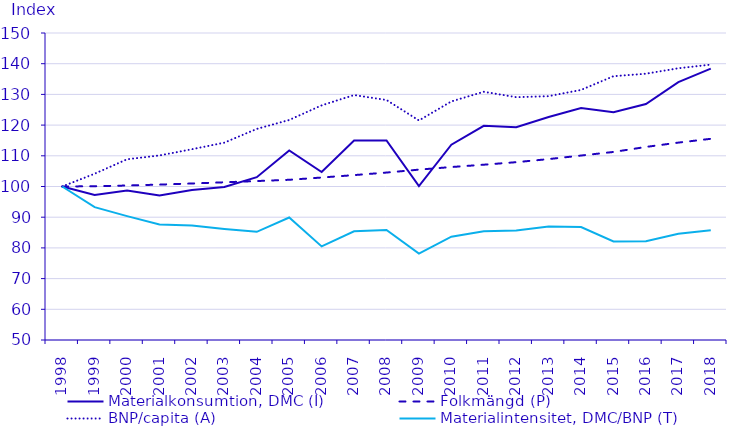
| Category | Materialkonsumtion, DMC (I) | Folkmängd (P) | BNP/capita (A) | Materialintensitet, DMC/BNP (T) |
|---|---|---|---|---|
| 1998.0 | 100 | 100 | 100 | 100 |
| 1999.0 | 97.241 | 100.08 | 104.164 | 93.279 |
| 2000.0 | 98.687 | 100.322 | 108.866 | 90.36 |
| 2001.0 | 97.091 | 100.619 | 110.117 | 87.628 |
| 2002.0 | 98.892 | 100.977 | 112.138 | 87.335 |
| 2003.0 | 99.823 | 101.37 | 114.282 | 86.167 |
| 2004.0 | 103.025 | 101.774 | 118.766 | 85.234 |
| 2005.0 | 111.765 | 102.185 | 121.67 | 89.895 |
| 2006.0 | 104.734 | 102.924 | 126.428 | 80.487 |
| 2007.0 | 114.994 | 103.711 | 129.784 | 85.433 |
| 2008.0 | 114.987 | 104.54 | 128.175 | 85.814 |
| 2009.0 | 100.135 | 105.493 | 121.505 | 78.121 |
| 2010.0 | 113.619 | 106.339 | 127.713 | 83.661 |
| 2011.0 | 119.768 | 107.099 | 130.859 | 85.458 |
| 2012.0 | 119.331 | 107.923 | 129.095 | 85.65 |
| 2013.0 | 122.65 | 108.928 | 129.423 | 86.999 |
| 2014.0 | 125.596 | 110.086 | 131.466 | 86.782 |
| 2015.0 | 124.168 | 111.257 | 135.922 | 82.11 |
| 2016.0 | 126.883 | 112.884 | 136.736 | 82.203 |
| 2017.0 | 133.983 | 114.297 | 138.514 | 84.629 |
| 2018.0 | 138.379 | 115.539 | 139.697 | 85.734 |